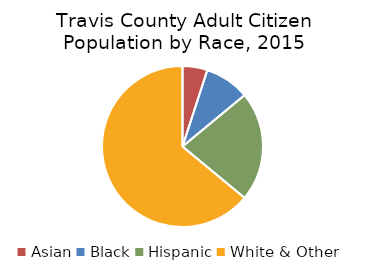
| Category | Population 18 & Over |
|---|---|
| Asian | 0.05 |
| Black | 0.09 |
| Hispanic | 0.22 |
| White & Other | 0.64 |